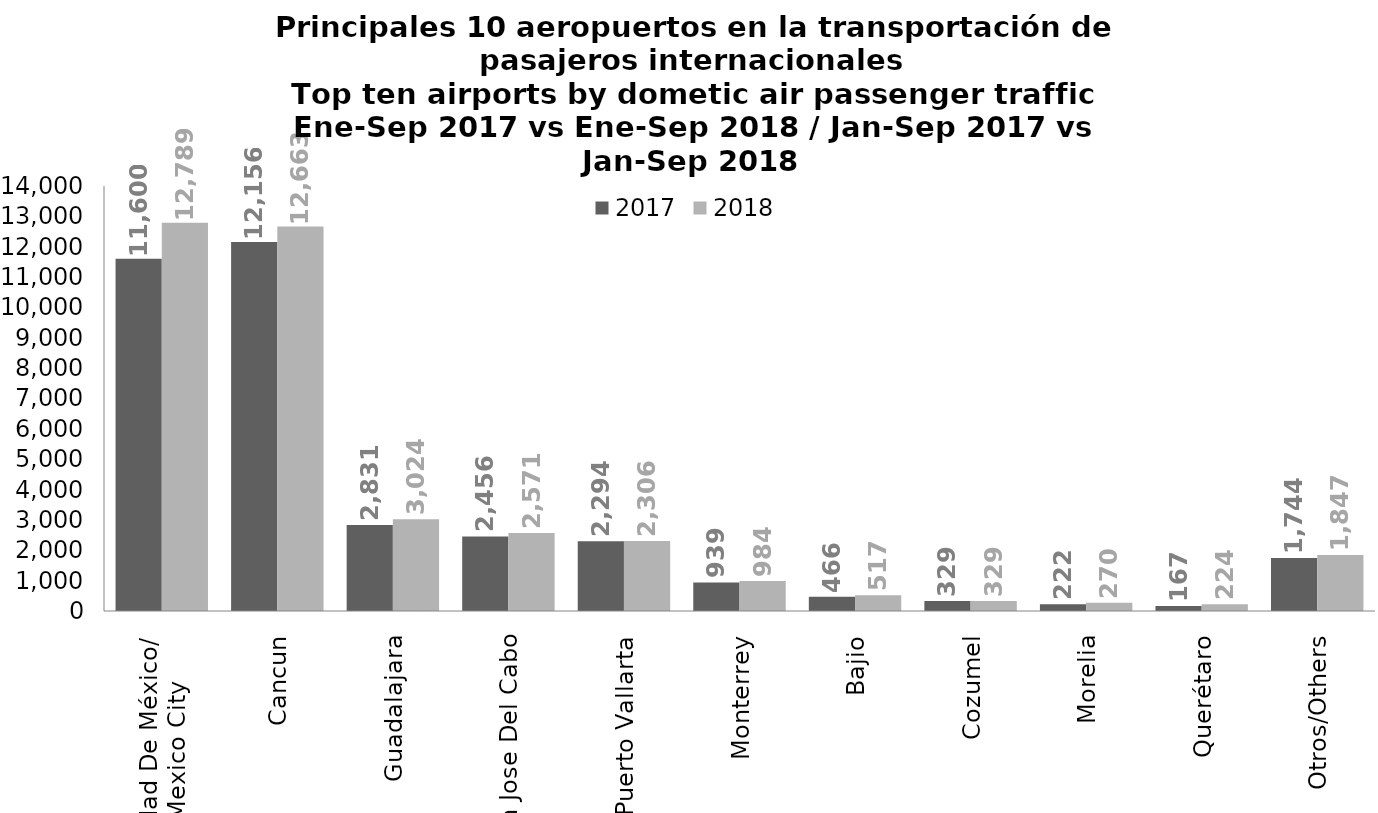
| Category | 2017 | 2018 |
|---|---|---|
| Ciudad De México/
Mexico City | 11600.047 | 12789.056 |
| Cancun | 12156.2 | 12663.402 |
| Guadalajara | 2830.893 | 3024.068 |
| San Jose Del Cabo | 2455.975 | 2571.351 |
| Puerto Vallarta | 2294.143 | 2305.904 |
| Monterrey | 938.979 | 984.47 |
| Bajio | 465.728 | 516.774 |
| Cozumel | 328.791 | 328.763 |
| Morelia | 221.666 | 270.495 |
| Querétaro | 166.512 | 223.7 |
| Otros/Others | 1744.393 | 1846.965 |